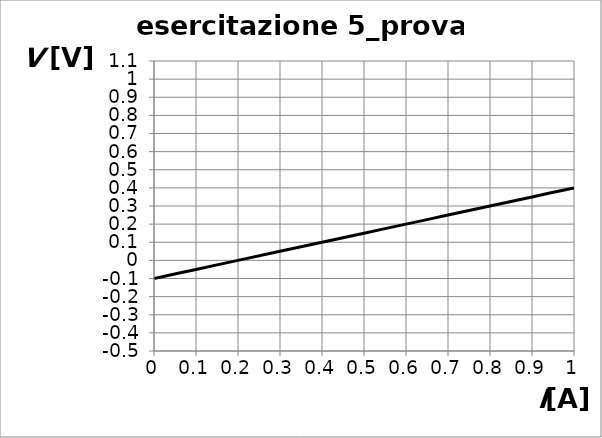
| Category | Series 0 |
|---|---|
| 0.0 | -0.1 |
| 0.1 | -0.05 |
| 0.2 | 0 |
| 0.30000000000000004 | 0.05 |
| 0.4 | 0.1 |
| 0.5 | 0.15 |
| 0.6 | 0.2 |
| 0.7 | 0.25 |
| 0.7999999999999999 | 0.3 |
| 0.8999999999999999 | 0.35 |
| 0.9999999999999999 | 0.4 |